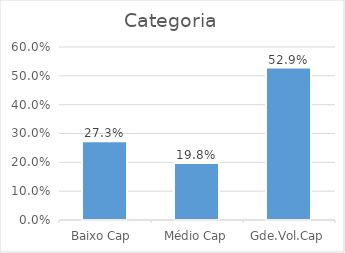
| Category | Contagem |
|---|---|
| Gde.Vol.Cap | 0.529 |
| Médio Cap | 0.198 |
| Baixo Cap  | 0.273 |